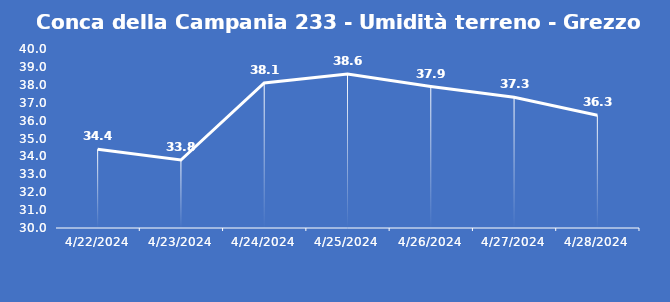
| Category | Conca della Campania 233 - Umidità terreno - Grezzo (%VWC) |
|---|---|
| 4/22/24 | 34.4 |
| 4/23/24 | 33.8 |
| 4/24/24 | 38.1 |
| 4/25/24 | 38.6 |
| 4/26/24 | 37.9 |
| 4/27/24 | 37.3 |
| 4/28/24 | 36.3 |